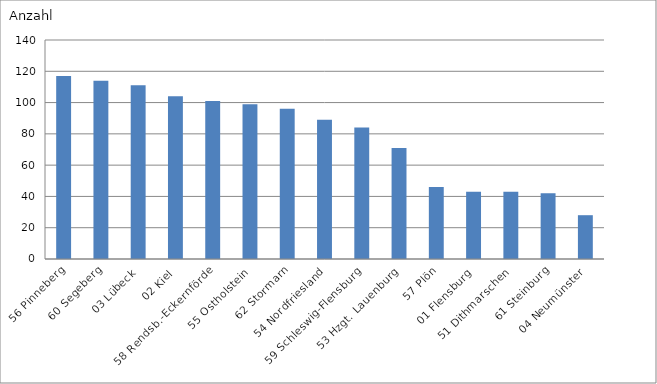
| Category | 56 Pinneberg |
|---|---|
| 56 Pinneberg | 117 |
| 60 Segeberg | 114 |
| 03 Lübeck | 111 |
| 02 Kiel | 104 |
| 58 Rendsb.-Eckernförde | 101 |
| 55 Ostholstein | 99 |
| 62 Stormarn | 96 |
| 54 Nordfriesland | 89 |
| 59 Schleswig-Flensburg | 84 |
| 53 Hzgt. Lauenburg | 71 |
| 57 Plön | 46 |
| 01 Flensburg | 43 |
| 51 Dithmarschen | 43 |
| 61 Steinburg | 42 |
| 04 Neumünster | 28 |